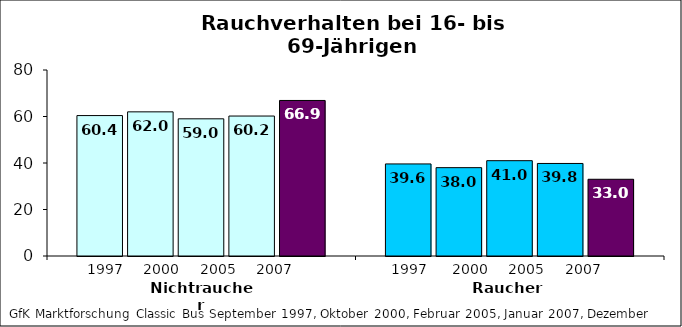
| Category | 1997 | 2000 | 2005 | 2007 | 2011 |
|---|---|---|---|---|---|
| Nichtraucher | 60.4 | 62 | 59 | 60.2 | 66.9 |
| Raucher | 39.6 | 38 | 41 | 39.8 | 33 |